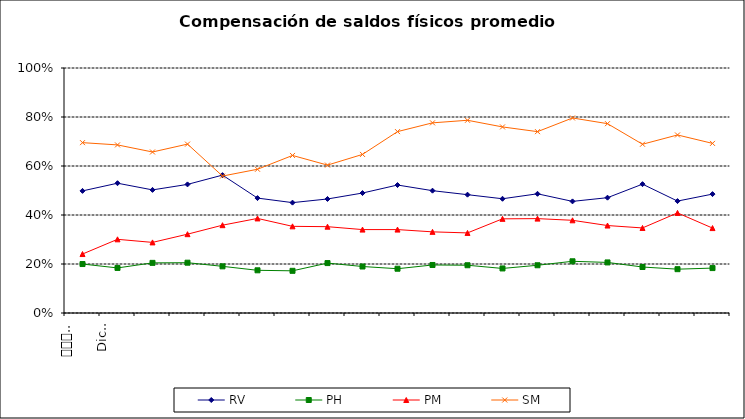
| Category | RV | PH | PM | SM |
|---|---|---|---|---|
| 0 | 0.498 | 0.2 | 0.241 | 0.695 |
| 1 | 0.53 | 0.184 | 0.301 | 0.686 |
| 2 | 0.502 | 0.205 | 0.288 | 0.657 |
| 3 | 0.525 | 0.205 | 0.322 | 0.689 |
| 4 | 0.563 | 0.19 | 0.358 | 0.559 |
| 5 | 0.469 | 0.174 | 0.386 | 0.587 |
| 6 | 0.45 | 0.172 | 0.354 | 0.643 |
| 7 | 0.465 | 0.204 | 0.352 | 0.604 |
| 8 | 0.49 | 0.19 | 0.34 | 0.647 |
| 9 | 0.522 | 0.181 | 0.34 | 0.74 |
| 10 | 0.499 | 0.196 | 0.331 | 0.776 |
| 11 | 0.483 | 0.195 | 0.327 | 0.787 |
| 12 | 0.466 | 0.182 | 0.384 | 0.759 |
| 13 | 0.486 | 0.195 | 0.385 | 0.74 |
| 14 | 0.456 | 0.211 | 0.378 | 0.796 |
| 15 | 0.471 | 0.206 | 0.357 | 0.773 |
| 16 | 0.526 | 0.188 | 0.347 | 0.689 |
| 17 | 0.457 | 0.179 | 0.409 | 0.727 |
| 18 | 0.485 | 0.183 | 0.347 | 0.692 |